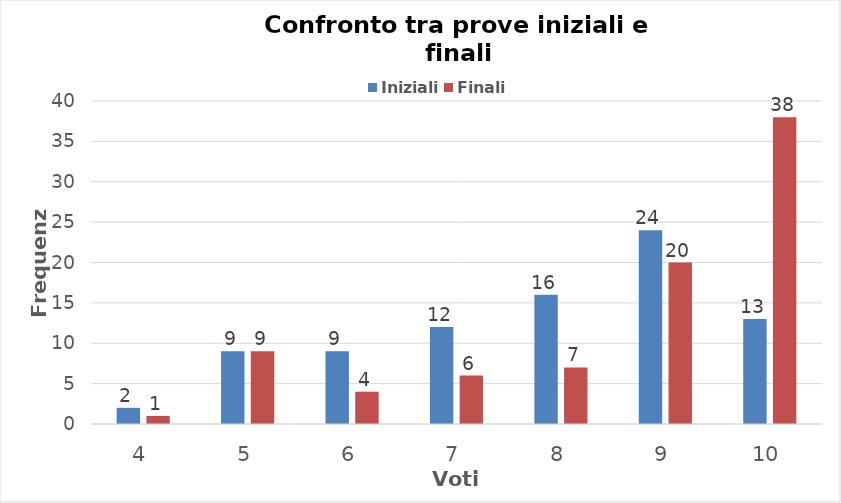
| Category | Iniziali | Finali |
|---|---|---|
| 4.0 | 2 | 1 |
| 5.0 | 9 | 9 |
| 6.0 | 9 | 4 |
| 7.0 | 12 | 6 |
| 8.0 | 16 | 7 |
| 9.0 | 24 | 20 |
| 10.0 | 13 | 38 |